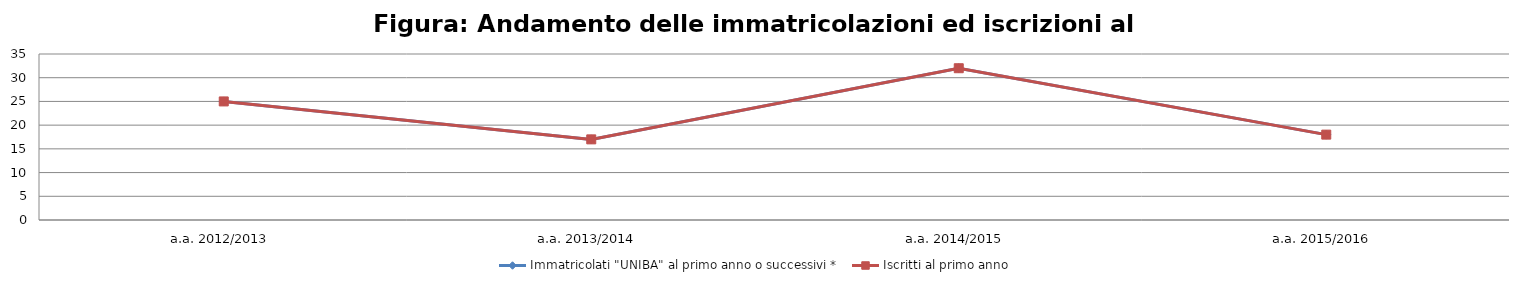
| Category | Immatricolati "UNIBA" al primo anno o successivi * | Iscritti al primo anno  |
|---|---|---|
| a.a. 2012/2013 | 25 | 25 |
| a.a. 2013/2014 | 17 | 17 |
| a.a. 2014/2015 | 32 | 32 |
| a.a. 2015/2016 | 18 | 18 |